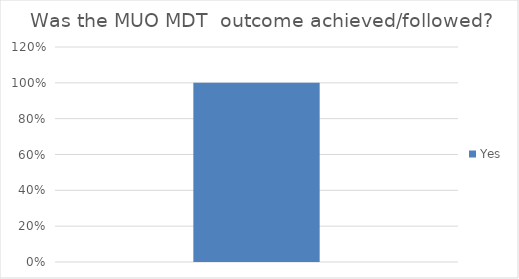
| Category | Yes |
|---|---|
| 0 | 1 |